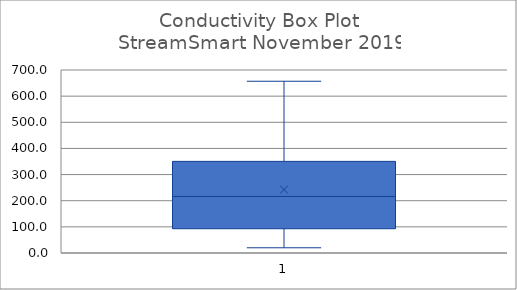
| Category | Max | Mean | Min |
|---|---|---|---|
| 2019-11-01 | 657 | 242.6 | 20 |
| 2019-08-01 | 727 | 307 | 36.9 |
| 2019-05-01 | 583 | 238.1 | 25.2 |
| 2019-02-01 | 526 | 267.8 | 21.3 |
| 2018-11-01 | 593 | 286.7 | 22.1 |
| 2018-08-01 | 662 | 310.721 | 41.9 |
| 2018-05-01 | 512 | 247.8 | 21.3 |
| 2018-02-01 | 725 | 314.511 | 21.3 |
| 2017-11-01 | 774 | 334.9 | 27.9 |
| 2017-08-01 | 468 | 258.182 | 31 |
| 2017-05-01 | 511 | 223.312 | 28.8 |
| 2017-02-01 | 655 | 301.2 | 26.8 |
| 2016-11-01 | 842 | 373.7 | 49.2 |